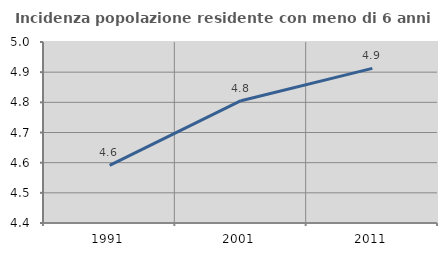
| Category | Incidenza popolazione residente con meno di 6 anni |
|---|---|
| 1991.0 | 4.591 |
| 2001.0 | 4.806 |
| 2011.0 | 4.913 |